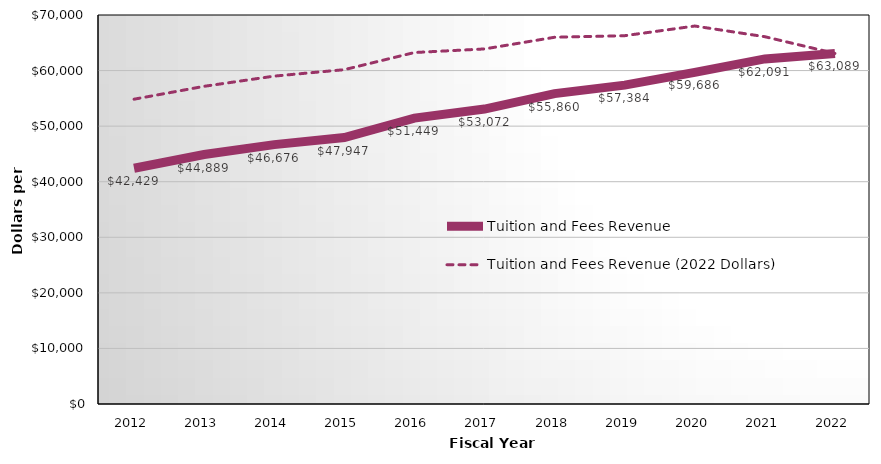
| Category | Tuition and Fees Revenue | Tuition and Fees Revenue (2022 Dollars) |
|---|---|---|
| 2012.0 | 42429 | 54848.423 |
| 2013.0 | 44889 | 57166.748 |
| 2014.0 | 46676 | 59003.317 |
| 2015.0 | 47947 | 60164.202 |
| 2016.0 | 51449 | 63246.307 |
| 2017.0 | 53072 | 63891.993 |
| 2018.0 | 55860 | 65993.484 |
| 2019.0 | 57384 | 66276.176 |
| 2020.0 | 59686 | 68014.942 |
| 2021.0 | 62091 | 66092.358 |
| 2022.0 | 63089 | 63089 |